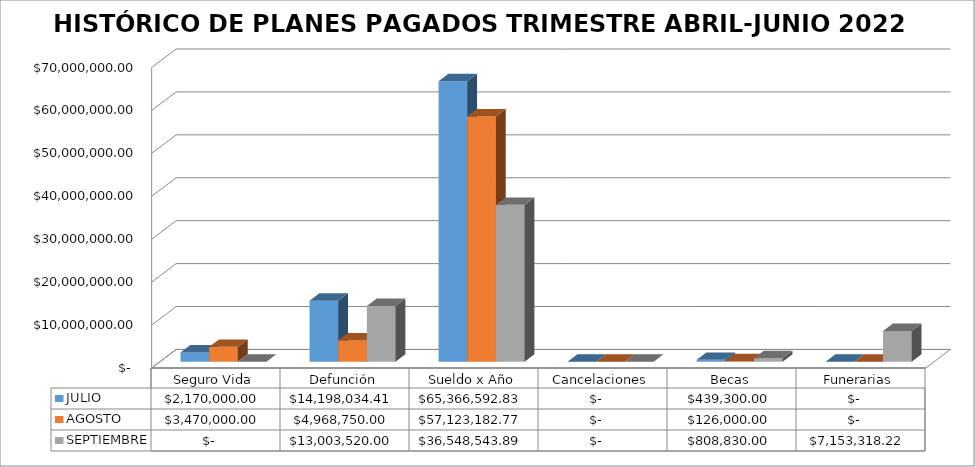
| Category | JULIO | AGOSTO | SEPTIEMBRE |
|---|---|---|---|
| Seguro Vida | 2170000 | 3470000 | 0 |
| Defunción | 14198034.41 | 4968750 | 13003520 |
| Sueldo x Año | 65366592.83 | 57123182.77 | 36548543.89 |
| Cancelaciones | 0 | 0 | 0 |
| Becas | 439300 | 126000 | 808830 |
| Funerarias | 0 | 0 | 7153318.22 |